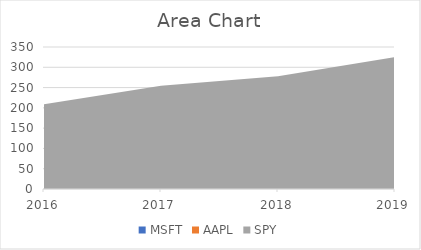
| Category | MSFT | AAPL | SPY |
|---|---|---|---|
| 2016.0 | 175.65 | 110.08 | 208.72 |
| 2017.0 | 200 | 163.43 | 254.22 |
| 2018.0 | 247 | 224 | 278 |
| 2019.0 | 300 | 150 | 325 |